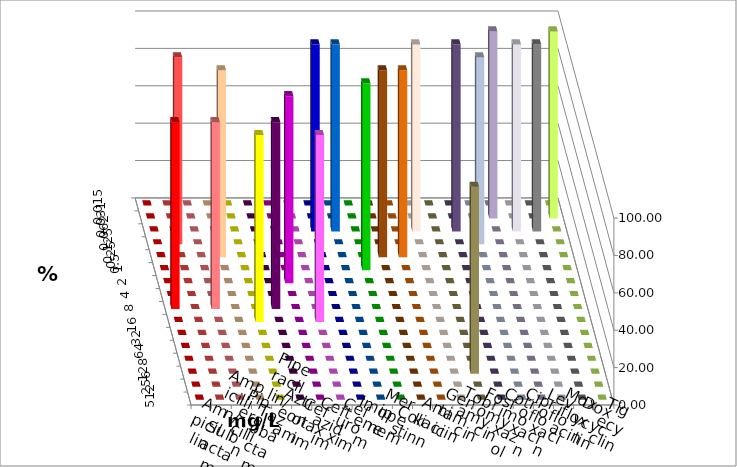
| Category | Ampicillin | Ampicillin/ Sulbactam | Piperacillin | Piperacillin/ Tazobactam | Aztreonam | Cefotaxim | Ceftazidim | Cefuroxim | Imipenem | Meropenem | Colistin | Amikacin | Gentamicin | Tobramycin | Fosfomycin | Cotrimoxazol | Ciprofloxacin | Levofloxacin | Moxifloxacin | Doxycyclin | Tigecyclin |
|---|---|---|---|---|---|---|---|---|---|---|---|---|---|---|---|---|---|---|---|---|---|
| 0.015 | 0 | 0 | 0 | 0 | 0 | 0 | 0 | 0 | 0 | 0 | 0 | 0 | 0 | 0 | 0 | 0 | 0 | 0 | 0 | 0 | 0 |
| 0.031 | 0 | 0 | 0 | 0 | 0 | 0 | 0 | 0 | 0 | 0 | 0 | 0 | 0 | 0 | 0 | 0 | 0 | 100 | 0 | 0 | 100 |
| 0.062 | 0 | 0 | 0 | 0 | 0 | 0 | 0 | 0 | 100 | 100 | 0 | 0 | 0 | 100 | 0 | 100 | 0 | 0 | 100 | 100 | 0 |
| 0.125 | 0 | 100 | 0 | 0 | 0 | 0 | 0 | 0 | 0 | 0 | 0 | 0 | 0 | 0 | 0 | 0 | 100 | 0 | 0 | 0 | 0 |
| 0.25 | 0 | 0 | 0 | 100 | 0 | 0 | 0 | 0 | 0 | 0 | 0 | 100 | 100 | 0 | 0 | 0 | 0 | 0 | 0 | 0 | 0 |
| 0.5 | 0 | 0 | 0 | 0 | 0 | 0 | 0 | 0 | 0 | 0 | 100 | 0 | 0 | 0 | 0 | 0 | 0 | 0 | 0 | 0 | 0 |
| 1.0 | 0 | 0 | 0 | 0 | 0 | 0 | 100 | 0 | 0 | 0 | 0 | 0 | 0 | 0 | 0 | 0 | 0 | 0 | 0 | 0 | 0 |
| 2.0 | 0 | 0 | 0 | 0 | 0 | 0 | 0 | 0 | 0 | 0 | 0 | 0 | 0 | 0 | 0 | 0 | 0 | 0 | 0 | 0 | 0 |
| 4.0 | 100 | 0 | 100 | 0 | 0 | 100 | 0 | 0 | 0 | 0 | 0 | 0 | 0 | 0 | 0 | 0 | 0 | 0 | 0 | 0 | 0 |
| 8.0 | 0 | 0 | 0 | 0 | 100 | 0 | 0 | 100 | 0 | 0 | 0 | 0 | 0 | 0 | 0 | 0 | 0 | 0 | 0 | 0 | 0 |
| 16.0 | 0 | 0 | 0 | 0 | 0 | 0 | 0 | 0 | 0 | 0 | 0 | 0 | 0 | 0 | 0 | 0 | 0 | 0 | 0 | 0 | 0 |
| 32.0 | 0 | 0 | 0 | 0 | 0 | 0 | 0 | 0 | 0 | 0 | 0 | 0 | 0 | 0 | 0 | 0 | 0 | 0 | 0 | 0 | 0 |
| 64.0 | 0 | 0 | 0 | 0 | 0 | 0 | 0 | 0 | 0 | 0 | 0 | 0 | 0 | 0 | 0 | 0 | 0 | 0 | 0 | 0 | 0 |
| 128.0 | 0 | 0 | 0 | 0 | 0 | 0 | 0 | 0 | 0 | 0 | 0 | 0 | 0 | 0 | 100 | 0 | 0 | 0 | 0 | 0 | 0 |
| 256.0 | 0 | 0 | 0 | 0 | 0 | 0 | 0 | 0 | 0 | 0 | 0 | 0 | 0 | 0 | 0 | 0 | 0 | 0 | 0 | 0 | 0 |
| 512.0 | 0 | 0 | 0 | 0 | 0 | 0 | 0 | 0 | 0 | 0 | 0 | 0 | 0 | 0 | 0 | 0 | 0 | 0 | 0 | 0 | 0 |